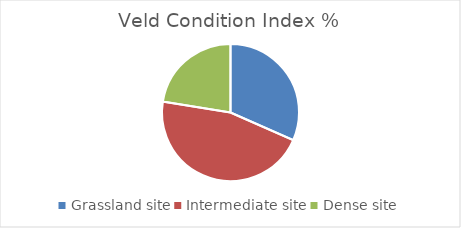
| Category | Veld Condition Index % |
|---|---|
| Grassland site | 36.4 |
| Intermediate site | 52.944 |
| Dense site | 25.875 |